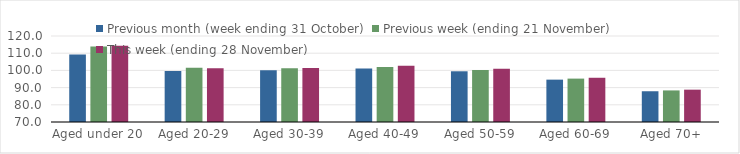
| Category | Previous month (week ending 31 October) | Previous week (ending 21 November) | This week (ending 28 November) |
|---|---|---|---|
| Aged under 20 | 109.24 | 113.86 | 114.4 |
| Aged 20-29 | 99.68 | 101.5 | 101.28 |
| Aged 30-39 | 100.15 | 101.19 | 101.44 |
| Aged 40-49 | 101.05 | 102.03 | 102.67 |
| Aged 50-59 | 99.49 | 100.22 | 100.97 |
| Aged 60-69 | 94.63 | 95.23 | 95.72 |
| Aged 70+ | 87.88 | 88.36 | 88.8 |